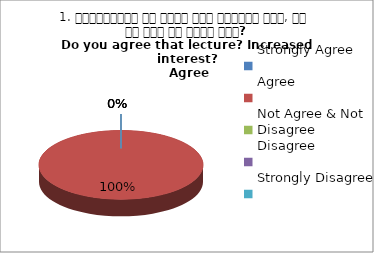
| Category | 1. व्याख्यान से रूचि में वृद्धि हुई, आप इस बात से सहमत हैं?
Do you agree that lecture? Increased interest?
 Agree |
|---|---|
| Strongly Agree | 0 |
| Agree | 1 |
| Not Agree & Not Disagree | 0 |
| Disagree | 0 |
| Strongly Disagree | 0 |